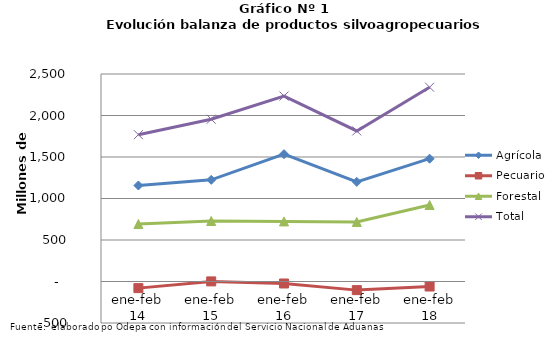
| Category | Agrícola | Pecuario | Forestal | Total |
|---|---|---|---|---|
| ene-feb 14 | 1156572 | -79871 | 692070 | 1768771 |
| ene-feb 15 | 1224747 | 1264 | 729211 | 1955222 |
| ene-feb 16 | 1534243 | -24051 | 724001 | 2234193 |
| ene-feb 17 | 1200005 | -103862 | 717594 | 1813737 |
| ene-feb 18 | 1479594 | -60524 | 921537 | 2340607 |